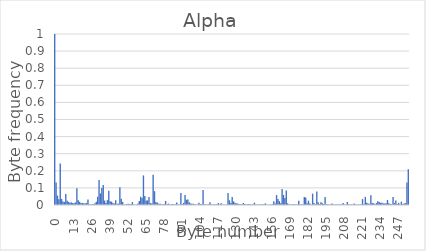
| Category | Series 0 |
|---|---|
| 0.0 | 1 |
| 1.0 | 0.132 |
| 2.0 | 0.055 |
| 3.0 | 0.033 |
| 4.0 | 0.243 |
| 5.0 | 0.035 |
| 6.0 | 0.02 |
| 7.0 | 0.018 |
| 8.0 | 0.064 |
| 9.0 | 0.025 |
| 10.0 | 0.018 |
| 11.0 | 0.014 |
| 12.0 | 0.015 |
| 13.0 | 0.012 |
| 14.0 | 0.01 |
| 15.0 | 0.015 |
| 16.0 | 0.099 |
| 17.0 | 0.028 |
| 18.0 | 0.019 |
| 19.0 | 0.012 |
| 20.0 | 0.012 |
| 21.0 | 0.01 |
| 22.0 | 0.009 |
| 23.0 | 0.012 |
| 24.0 | 0.032 |
| 25.0 | 0.005 |
| 26.0 | 0.002 |
| 27.0 | 0.004 |
| 28.0 | 0.005 |
| 29.0 | 0.01 |
| 30.0 | 0.019 |
| 31.0 | 0.048 |
| 32.0 | 0.146 |
| 33.0 | 0.068 |
| 34.0 | 0.1 |
| 35.0 | 0.116 |
| 36.0 | 0.026 |
| 37.0 | 0.012 |
| 38.0 | 0.028 |
| 39.0 | 0.084 |
| 40.0 | 0.022 |
| 41.0 | 0.019 |
| 42.0 | 0.012 |
| 43.0 | 0.009 |
| 44.0 | 0.027 |
| 45.0 | 0.008 |
| 46.0 | 0.008 |
| 47.0 | 0.104 |
| 48.0 | 0.036 |
| 49.0 | 0.018 |
| 50.0 | 0.005 |
| 51.0 | 0.003 |
| 52.0 | 0.005 |
| 53.0 | 0.007 |
| 54.0 | 0.005 |
| 55.0 | 0.005 |
| 56.0 | 0.017 |
| 57.0 | 0.002 |
| 58.0 | 0.002 |
| 59.0 | 0.002 |
| 60.0 | 0.009 |
| 61.0 | 0.023 |
| 62.0 | 0.049 |
| 63.0 | 0.041 |
| 64.0 | 0.173 |
| 65.0 | 0.053 |
| 66.0 | 0.026 |
| 67.0 | 0.027 |
| 68.0 | 0.047 |
| 69.0 | 0.011 |
| 70.0 | 0.009 |
| 71.0 | 0.177 |
| 72.0 | 0.081 |
| 73.0 | 0.018 |
| 74.0 | 0.014 |
| 75.0 | 0.007 |
| 76.0 | 0.007 |
| 77.0 | 0.004 |
| 78.0 | 0.004 |
| 79.0 | 0.006 |
| 80.0 | 0.023 |
| 81.0 | 0.005 |
| 82.0 | 0.008 |
| 83.0 | 0.002 |
| 84.0 | 0.004 |
| 85.0 | 0.006 |
| 86.0 | 0.004 |
| 87.0 | 0.004 |
| 88.0 | 0.014 |
| 89.0 | 0.003 |
| 90.0 | 0.002 |
| 91.0 | 0.07 |
| 92.0 | 0.004 |
| 93.0 | 0.012 |
| 94.0 | 0.059 |
| 95.0 | 0.031 |
| 96.0 | 0.032 |
| 97.0 | 0.017 |
| 98.0 | 0.009 |
| 99.0 | 0.007 |
| 100.0 | 0.007 |
| 101.0 | 0.004 |
| 102.0 | 0.003 |
| 103.0 | 0.003 |
| 104.0 | 0.013 |
| 105.0 | 0.006 |
| 106.0 | 0.005 |
| 107.0 | 0.087 |
| 108.0 | 0.005 |
| 109.0 | 0.003 |
| 110.0 | 0.003 |
| 111.0 | 0.005 |
| 112.0 | 0.016 |
| 113.0 | 0.003 |
| 114.0 | 0.003 |
| 115.0 | 0.004 |
| 116.0 | 0.004 |
| 117.0 | 0.004 |
| 118.0 | 0.011 |
| 119.0 | 0.003 |
| 120.0 | 0.011 |
| 121.0 | 0.002 |
| 122.0 | 0.002 |
| 123.0 | 0.002 |
| 124.0 | 0.003 |
| 125.0 | 0.071 |
| 126.0 | 0.028 |
| 127.0 | 0.012 |
| 128.0 | 0.046 |
| 129.0 | 0.021 |
| 130.0 | 0.013 |
| 131.0 | 0.009 |
| 132.0 | 0.009 |
| 133.0 | 0.006 |
| 134.0 | 0.004 |
| 135.0 | 0.005 |
| 136.0 | 0.012 |
| 137.0 | 0.006 |
| 138.0 | 0.004 |
| 139.0 | 0.004 |
| 140.0 | 0.006 |
| 141.0 | 0.004 |
| 142.0 | 0.003 |
| 143.0 | 0.004 |
| 144.0 | 0.013 |
| 145.0 | 0.003 |
| 146.0 | 0.003 |
| 147.0 | 0.002 |
| 148.0 | 0.005 |
| 149.0 | 0.004 |
| 150.0 | 0.003 |
| 151.0 | 0.005 |
| 152.0 | 0.01 |
| 153.0 | 0.002 |
| 154.0 | 0.002 |
| 155.0 | 0.002 |
| 156.0 | 0.004 |
| 157.0 | 0.005 |
| 158.0 | 0.022 |
| 159.0 | 0.008 |
| 160.0 | 0.058 |
| 161.0 | 0.036 |
| 162.0 | 0.023 |
| 163.0 | 0.01 |
| 164.0 | 0.094 |
| 165.0 | 0.059 |
| 166.0 | 0.04 |
| 167.0 | 0.085 |
| 168.0 | 0.01 |
| 169.0 | 0.004 |
| 170.0 | 0.003 |
| 171.0 | 0.003 |
| 172.0 | 0.004 |
| 173.0 | 0.003 |
| 174.0 | 0.002 |
| 175.0 | 0.003 |
| 176.0 | 0.025 |
| 177.0 | 0.005 |
| 178.0 | 0.003 |
| 179.0 | 0.005 |
| 180.0 | 0.047 |
| 181.0 | 0.043 |
| 182.0 | 0.01 |
| 183.0 | 0.025 |
| 184.0 | 0.009 |
| 185.0 | 0.002 |
| 186.0 | 0.066 |
| 187.0 | 0.012 |
| 188.0 | 0.004 |
| 189.0 | 0.079 |
| 190.0 | 0.016 |
| 191.0 | 0.006 |
| 192.0 | 0.016 |
| 193.0 | 0.011 |
| 194.0 | 0.006 |
| 195.0 | 0.046 |
| 196.0 | 0.005 |
| 197.0 | 0.003 |
| 198.0 | 0.003 |
| 199.0 | 0.003 |
| 200.0 | 0.009 |
| 201.0 | 0.003 |
| 202.0 | 0.003 |
| 203.0 | 0.002 |
| 204.0 | 0.004 |
| 205.0 | 0.002 |
| 206.0 | 0.003 |
| 207.0 | 0.003 |
| 208.0 | 0.011 |
| 209.0 | 0.003 |
| 210.0 | 0.002 |
| 211.0 | 0.018 |
| 212.0 | 0.003 |
| 213.0 | 0.004 |
| 214.0 | 0.003 |
| 215.0 | 0.004 |
| 216.0 | 0.009 |
| 217.0 | 0.003 |
| 218.0 | 0.002 |
| 219.0 | 0.002 |
| 220.0 | 0.003 |
| 221.0 | 0.004 |
| 222.0 | 0.035 |
| 223.0 | 0.005 |
| 224.0 | 0.047 |
| 225.0 | 0.014 |
| 226.0 | 0.008 |
| 227.0 | 0.007 |
| 228.0 | 0.057 |
| 229.0 | 0.012 |
| 230.0 | 0.01 |
| 231.0 | 0.005 |
| 232.0 | 0.011 |
| 233.0 | 0.021 |
| 234.0 | 0.017 |
| 235.0 | 0.013 |
| 236.0 | 0.013 |
| 237.0 | 0.009 |
| 238.0 | 0.009 |
| 239.0 | 0.01 |
| 240.0 | 0.029 |
| 241.0 | 0.011 |
| 242.0 | 0.006 |
| 243.0 | 0.005 |
| 244.0 | 0.047 |
| 245.0 | 0.011 |
| 246.0 | 0.027 |
| 247.0 | 0.006 |
| 248.0 | 0.013 |
| 249.0 | 0.004 |
| 250.0 | 0.02 |
| 251.0 | 0.006 |
| 252.0 | 0.009 |
| 253.0 | 0.011 |
| 254.0 | 0.132 |
| 255.0 | 0.209 |